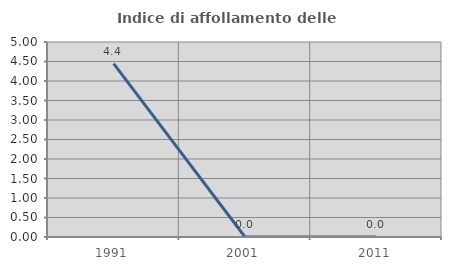
| Category | Indice di affollamento delle abitazioni  |
|---|---|
| 1991.0 | 4.444 |
| 2001.0 | 0 |
| 2011.0 | 0 |